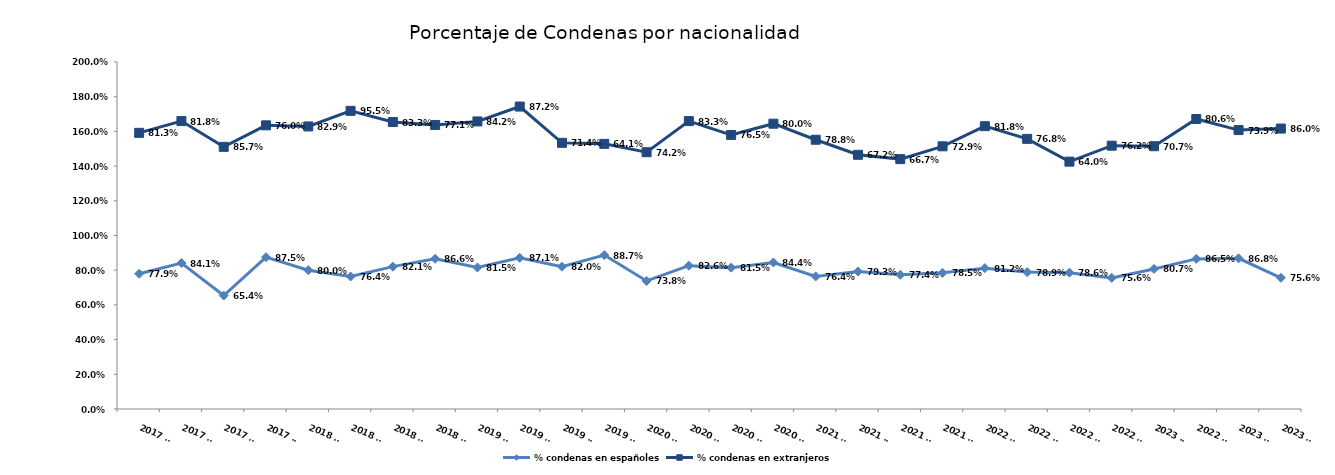
| Category | % condenas en españoles | % condenas en extranjeros |
|---|---|---|
| 2017 T1 | 0.779 | 0.812 |
| 2017 T2 | 0.841 | 0.818 |
| 2017 T3 | 0.654 | 0.857 |
| 2017 T4 | 0.875 | 0.76 |
| 2018 T1 | 0.8 | 0.829 |
| 2018 T2 | 0.764 | 0.955 |
| 2018 T3 | 0.821 | 0.833 |
| 2018 T4 | 0.866 | 0.771 |
| 2019 T1 | 0.815 | 0.842 |
| 2019 T2 | 0.871 | 0.872 |
| 2019 T3 | 0.82 | 0.714 |
| 2019 T4 | 0.887 | 0.641 |
| 2020 T1 | 0.738 | 0.742 |
| 2020 T2 | 0.826 | 0.833 |
| 2020 T3 | 0.815 | 0.765 |
| 2020 T4 | 0.844 | 0.8 |
| 2021 T1 | 0.764 | 0.788 |
| 2021 T2 | 0.793 | 0.672 |
| 2021 T3 | 0.774 | 0.667 |
| 2021 T4 | 0.785 | 0.729 |
| 2022 T1 | 0.812 | 0.818 |
| 2022 T2 | 0.789 | 0.768 |
| 2022 T3 | 0.786 | 0.64 |
| 2022 T4 | 0.756 | 0.762 |
| 2023 T1 | 0.807 | 0.707 |
| 2022 T2 | 0.865 | 0.806 |
| 2023 T3 | 0.868 | 0.739 |
| 2023 T4 | 0.756 | 0.86 |